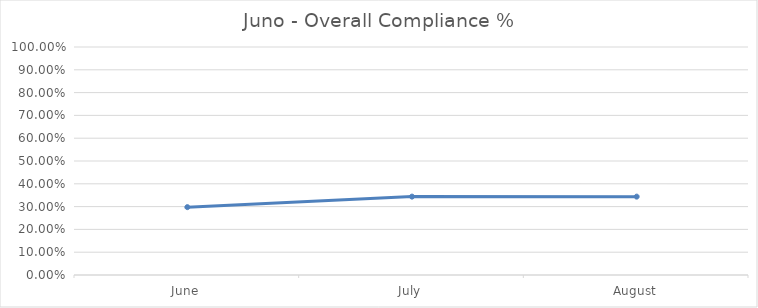
| Category | Juno - Overall Compliance % |
|---|---|
| June | 0.298 |
| July | 0.344 |
| August | 0.344 |